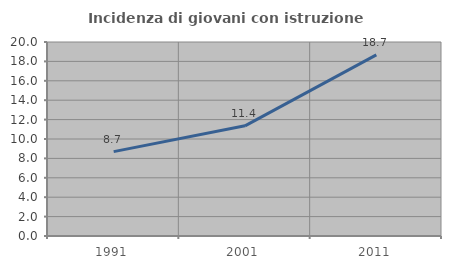
| Category | Incidenza di giovani con istruzione universitaria |
|---|---|
| 1991.0 | 8.696 |
| 2001.0 | 11.358 |
| 2011.0 | 18.671 |